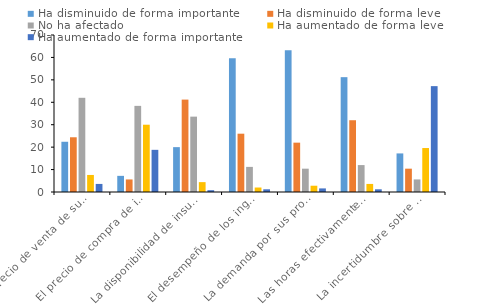
| Category | Ha disminuido de forma importante | Ha disminuido de forma leve | No ha afectado | Ha aumentado de forma leve | Ha aumentado de forma importante |
|---|---|---|---|---|---|
| El precio de venta de sus productos o servicios | 22.4 | 24.4 | 42 | 7.6 | 3.6 |
| El precio de compra de insumos o materias primas | 7.2 | 5.6 | 38.4 | 30 | 18.8 |
| La disponibilidad de insumos o materias primas | 20 | 41.2 | 33.6 | 4.4 | 0.8 |
| El desempeño de los ingresos de su negocio | 59.6 | 26 | 11.2 | 2 | 1.2 |
| La demanda por sus productos o servicios | 63.2 | 22 | 10.4 | 2.8 | 1.6 |
| Las horas efectivamente trabajadas | 51.2 | 32 | 12 | 3.6 | 1.2 |
| La incertidumbre sobre el futuro de su negocio | 17.2 | 10.4 | 5.6 | 19.6 | 47.2 |